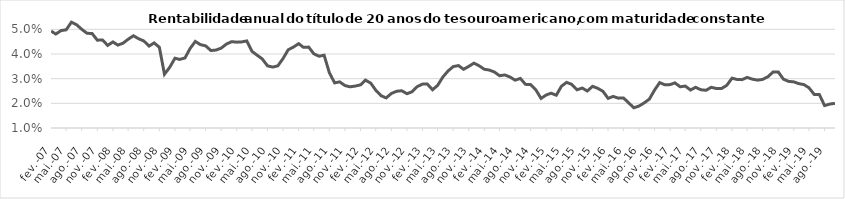
| Category | Ativo livre de risco (Rf) (%aa) |
|---|---|
| 2007-02-01 | 0.049 |
| 2007-03-01 | 0.048 |
| 2007-04-01 | 0.05 |
| 2007-05-01 | 0.05 |
| 2007-06-01 | 0.053 |
| 2007-07-01 | 0.052 |
| 2007-08-01 | 0.05 |
| 2007-09-01 | 0.048 |
| 2007-10-01 | 0.048 |
| 2007-11-01 | 0.046 |
| 2007-12-01 | 0.046 |
| 2008-01-01 | 0.044 |
| 2008-02-01 | 0.045 |
| 2008-03-01 | 0.044 |
| 2008-04-01 | 0.044 |
| 2008-05-01 | 0.046 |
| 2008-06-01 | 0.047 |
| 2008-07-01 | 0.046 |
| 2008-08-01 | 0.045 |
| 2008-09-01 | 0.043 |
| 2008-10-01 | 0.045 |
| 2008-11-01 | 0.043 |
| 2008-12-01 | 0.032 |
| 2009-01-01 | 0.035 |
| 2009-02-01 | 0.038 |
| 2009-03-01 | 0.038 |
| 2009-04-01 | 0.038 |
| 2009-05-01 | 0.042 |
| 2009-06-01 | 0.045 |
| 2009-07-01 | 0.044 |
| 2009-08-01 | 0.043 |
| 2009-09-01 | 0.041 |
| 2009-10-01 | 0.042 |
| 2009-11-01 | 0.042 |
| 2009-12-01 | 0.044 |
| 2010-01-01 | 0.045 |
| 2010-02-01 | 0.045 |
| 2010-03-01 | 0.045 |
| 2010-04-01 | 0.045 |
| 2010-05-01 | 0.041 |
| 2010-06-01 | 0.04 |
| 2010-07-01 | 0.038 |
| 2010-08-01 | 0.035 |
| 2010-09-01 | 0.035 |
| 2010-10-01 | 0.035 |
| 2010-11-01 | 0.038 |
| 2010-12-01 | 0.042 |
| 2011-01-01 | 0.043 |
| 2011-02-01 | 0.044 |
| 2011-03-01 | 0.043 |
| 2011-04-01 | 0.043 |
| 2011-05-01 | 0.04 |
| 2011-06-01 | 0.039 |
| 2011-07-01 | 0.04 |
| 2011-08-01 | 0.032 |
| 2011-09-01 | 0.028 |
| 2011-10-01 | 0.029 |
| 2011-11-01 | 0.027 |
| 2011-12-01 | 0.027 |
| 2012-01-01 | 0.027 |
| 2012-02-01 | 0.028 |
| 2012-03-01 | 0.029 |
| 2012-04-01 | 0.028 |
| 2012-05-01 | 0.025 |
| 2012-06-01 | 0.023 |
| 2012-07-01 | 0.022 |
| 2012-08-01 | 0.024 |
| 2012-09-01 | 0.025 |
| 2012-10-01 | 0.025 |
| 2012-11-01 | 0.024 |
| 2012-12-01 | 0.025 |
| 2013-01-01 | 0.027 |
| 2013-02-01 | 0.028 |
| 2013-03-01 | 0.028 |
| 2013-04-01 | 0.026 |
| 2013-05-01 | 0.027 |
| 2013-06-01 | 0.031 |
| 2013-07-01 | 0.033 |
| 2013-08-01 | 0.035 |
| 2013-09-01 | 0.035 |
| 2013-10-01 | 0.034 |
| 2013-11-01 | 0.035 |
| 2013-12-01 | 0.036 |
| 2014-01-01 | 0.035 |
| 2014-02-01 | 0.034 |
| 2014-03-01 | 0.034 |
| 2014-04-01 | 0.033 |
| 2014-05-01 | 0.031 |
| 2014-06-01 | 0.032 |
| 2014-07-01 | 0.031 |
| 2014-08-01 | 0.029 |
| 2014-09-01 | 0.03 |
| 2014-10-01 | 0.028 |
| 2014-11-01 | 0.028 |
| 2014-12-01 | 0.026 |
| 2015-01-01 | 0.022 |
| 2015-02-01 | 0.023 |
| 2015-03-01 | 0.024 |
| 2015-04-01 | 0.023 |
| 2015-05-01 | 0.027 |
| 2015-06-01 | 0.028 |
| 2015-07-01 | 0.028 |
| 2015-08-01 | 0.026 |
| 2015-09-01 | 0.026 |
| 2015-10-01 | 0.025 |
| 2015-11-01 | 0.027 |
| 2015-12-01 | 0.026 |
| 2016-01-01 | 0.025 |
| 2016-02-01 | 0.022 |
| 2016-03-01 | 0.023 |
| 2016-04-01 | 0.022 |
| 2016-05-01 | 0.022 |
| 2016-06-01 | 0.02 |
| 2016-07-01 | 0.018 |
| 2016-08-01 | 0.019 |
| 2016-09-01 | 0.02 |
| 2016-10-01 | 0.022 |
| 2016-11-01 | 0.025 |
| 2016-12-01 | 0.028 |
| 2017-01-01 | 0.028 |
| 2017-02-01 | 0.028 |
| 2017-03-01 | 0.028 |
| 2017-04-01 | 0.027 |
| 2017-05-01 | 0.027 |
| 2017-06-01 | 0.025 |
| 2017-07-01 | 0.026 |
| 2017-08-01 | 0.026 |
| 2017-09-01 | 0.025 |
| 2017-10-01 | 0.026 |
| 2017-11-01 | 0.026 |
| 2017-12-01 | 0.026 |
| 2018-01-01 | 0.027 |
| 2018-02-01 | 0.03 |
| 2018-03-01 | 0.03 |
| 2018-04-01 | 0.03 |
| 2018-05-01 | 0.03 |
| 2018-06-01 | 0.03 |
| 2018-07-01 | 0.029 |
| 2018-08-01 | 0.03 |
| 2018-09-01 | 0.031 |
| 2018-10-01 | 0.033 |
| 2018-11-01 | 0.033 |
| 2018-12-01 | 0.03 |
| 2019-01-01 | 0.029 |
| 2019-02-01 | 0.029 |
| 2019-03-01 | 0.028 |
| 2019-04-01 | 0.028 |
| 2019-05-01 | 0.026 |
| 2019-06-01 | 0.024 |
| 2019-07-01 | 0.024 |
| 2019-08-01 | 0.019 |
| 2019-09-01 | 0.02 |
| 2019-10-01 | 0.02 |